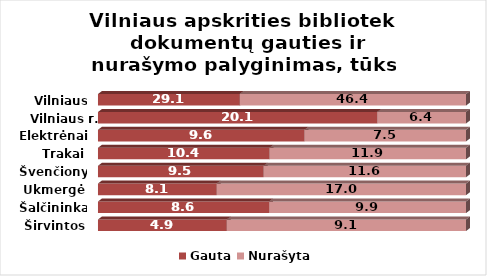
| Category | Gauta | Nurašyta |
|---|---|---|
| Širvintos | 4.9 | 9.1 |
| Šalčininkai | 8.6 | 9.9 |
| Ukmergė | 8.1 | 17 |
| Švenčionys | 9.5 | 11.6 |
| Trakai | 10.4 | 11.9 |
| Elektrėnai | 9.6 | 7.5 |
| Vilniaus r. | 20.1 | 6.4 |
| Vilniaus m. | 29.1 | 46.4 |